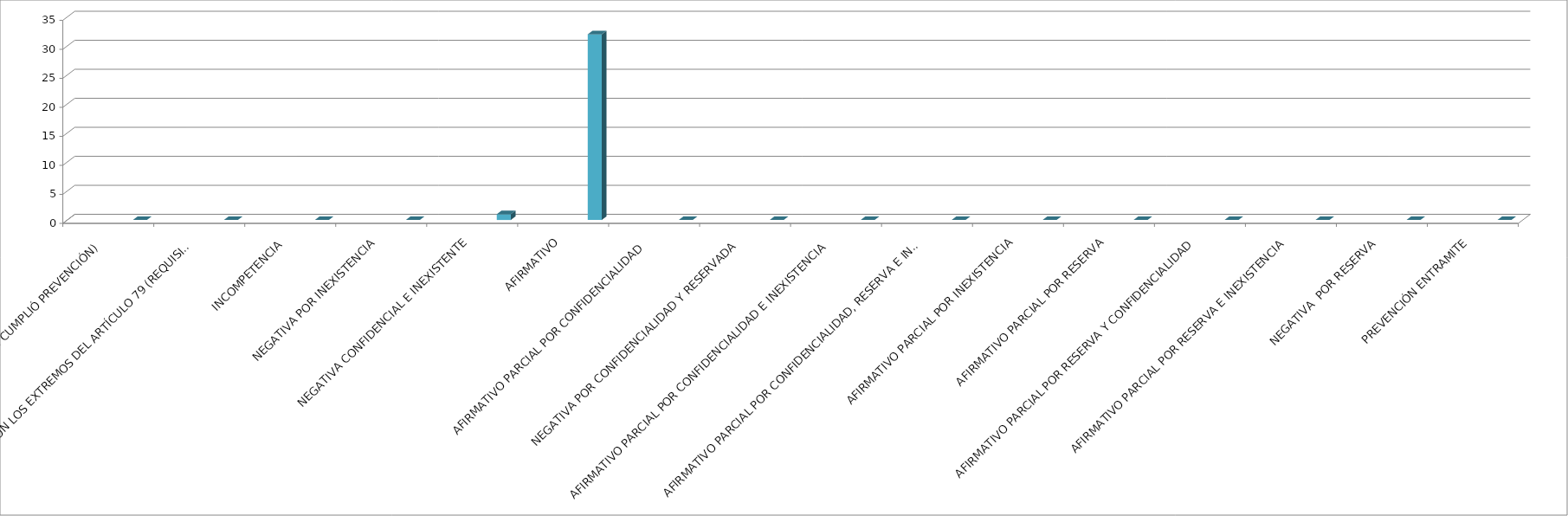
| Category | Series 0 | Series 1 | Series 2 | Series 3 | Series 4 |
|---|---|---|---|---|---|
| SE TIENE POR NO PRESENTADA ( NO CUMPLIÓ PREVENCIÓN) |  |  |  |  | 0 |
| NO CUMPLIO CON LOS EXTREMOS DEL ARTÍCULO 79 (REQUISITOS) |  |  |  |  | 0 |
| INCOMPETENCIA  |  |  |  |  | 0 |
| NEGATIVA POR INEXISTENCIA |  |  |  |  | 0 |
| NEGATIVA CONFIDENCIAL E INEXISTENTE |  |  |  |  | 1 |
| AFIRMATIVO |  |  |  |  | 32 |
| AFIRMATIVO PARCIAL POR CONFIDENCIALIDAD  |  |  |  |  | 0 |
| NEGATIVA POR CONFIDENCIALIDAD Y RESERVADA |  |  |  |  | 0 |
| AFIRMATIVO PARCIAL POR CONFIDENCIALIDAD E INEXISTENCIA |  |  |  |  | 0 |
| AFIRMATIVO PARCIAL POR CONFIDENCIALIDAD, RESERVA E INEXISTENCIA |  |  |  |  | 0 |
| AFIRMATIVO PARCIAL POR INEXISTENCIA |  |  |  |  | 0 |
| AFIRMATIVO PARCIAL POR RESERVA |  |  |  |  | 0 |
| AFIRMATIVO PARCIAL POR RESERVA Y CONFIDENCIALIDAD |  |  |  |  | 0 |
| AFIRMATIVO PARCIAL POR RESERVA E INEXISTENCIA |  |  |  |  | 0 |
| NEGATIVA  POR RESERVA |  |  |  |  | 0 |
| PREVENCIÓN ENTRAMITE |  |  |  |  | 0 |